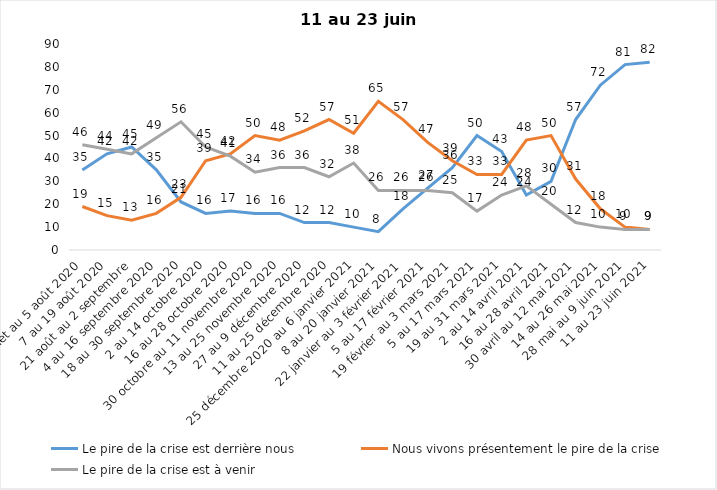
| Category | Le pire de la crise est derrière nous | Nous vivons présentement le pire de la crise | Le pire de la crise est à venir |
|---|---|---|---|
| 24 juillet au 5 août 2020 | 35 | 19 | 46 |
| 7 au 19 août 2020 | 42 | 15 | 44 |
| 21 août au 2 septembre | 45 | 13 | 42 |
| 4 au 16 septembre 2020 | 35 | 16 | 49 |
| 18 au 30 septembre 2020 | 21 | 23 | 56 |
| 2 au 14 octobre 2020 | 16 | 39 | 45 |
| 16 au 28 octobre 2020 | 17 | 42 | 41 |
| 30 octobre au 11 novembre 2020 | 16 | 50 | 34 |
| 13 au 25 novembre 2020 | 16 | 48 | 36 |
| 27 au 9 décembre 2020 | 12 | 52 | 36 |
| 11 au 25 décembre 2020 | 12 | 57 | 32 |
| 25 décembre 2020 au 6 janvier 2021 | 10 | 51 | 38 |
| 8 au 20 janvier 2021 | 8 | 65 | 26 |
| 22 janvier au 3 février 2021 | 18 | 57 | 26 |
| 5 au 17 février 2021 | 27 | 47 | 26 |
| 19 février au 3 mars 2021 | 36 | 39 | 25 |
| 5 au 17 mars 2021 | 50 | 33 | 17 |
| 19 au 31 mars 2021 | 43 | 33 | 24 |
| 2 au 14 avril 2021 | 24 | 48 | 28 |
| 16 au 28 avril 2021 | 30 | 50 | 20 |
| 30 avril au 12 mai 2021 | 57 | 31 | 12 |
| 14 au 26 mai 2021 | 72 | 18 | 10 |
| 28 mai au 9 juin 2021 | 81 | 10 | 9 |
| 11 au 23 juin 2021 | 82 | 9 | 9 |